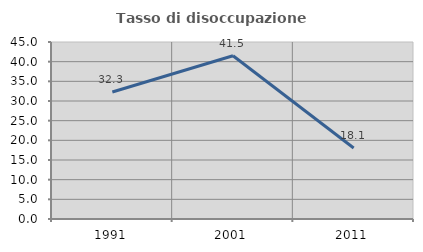
| Category | Tasso di disoccupazione giovanile  |
|---|---|
| 1991.0 | 32.278 |
| 2001.0 | 41.489 |
| 2011.0 | 18.056 |